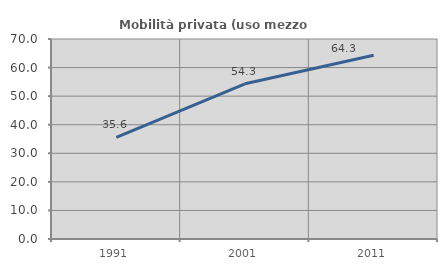
| Category | Mobilità privata (uso mezzo privato) |
|---|---|
| 1991.0 | 35.58 |
| 2001.0 | 54.324 |
| 2011.0 | 64.327 |